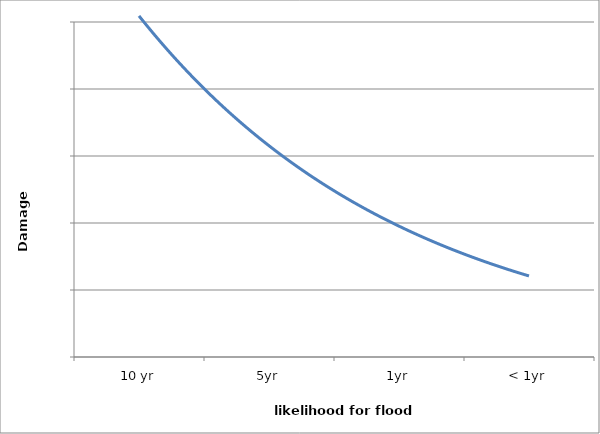
| Category | Type of event |
|---|---|
| 10 yr | 1.759 |
| 5yr | 1.893 |
| 1yr | 2.054 |
| < 1yr | 0.347 |